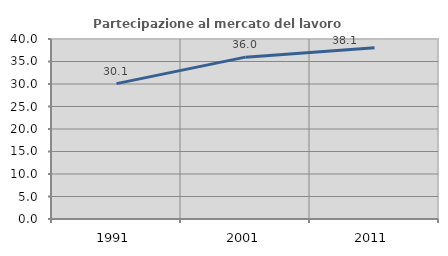
| Category | Partecipazione al mercato del lavoro  femminile |
|---|---|
| 1991.0 | 30.077 |
| 2001.0 | 35.969 |
| 2011.0 | 38.067 |